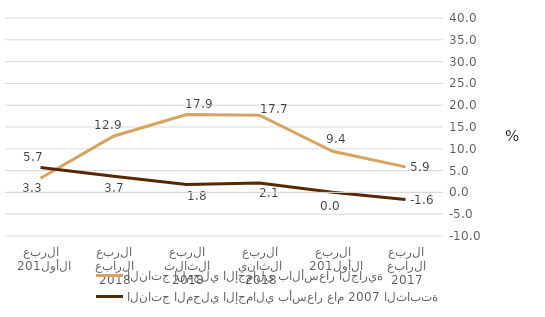
| Category | الناتج المحلي الإجمالي بالأسعار الجارية | الناتج المحلي الإجمالي بأسعار عام 2007 الثابتة  |
|---|---|---|
| الربع الرابع 2017 | 5.853 | -1.641 |
| الربع الأول 2018 | 9.421 | 0.025 |
| الربع الثاني 2018 | 17.696 | 2.134 |
| الربع الثالث 2018 | 17.875 | 1.806 |
| الربع الرابع 2018 | 12.876 | 3.698 |
| الربع الأول 2019 | 3.252 | 5.715 |